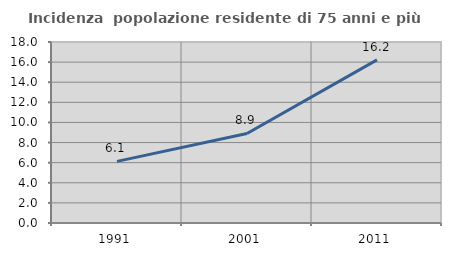
| Category | Incidenza  popolazione residente di 75 anni e più |
|---|---|
| 1991.0 | 6.126 |
| 2001.0 | 8.903 |
| 2011.0 | 16.225 |